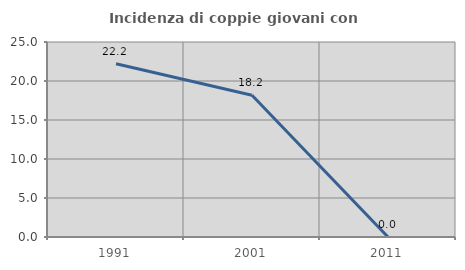
| Category | Incidenza di coppie giovani con figli |
|---|---|
| 1991.0 | 22.222 |
| 2001.0 | 18.182 |
| 2011.0 | 0 |